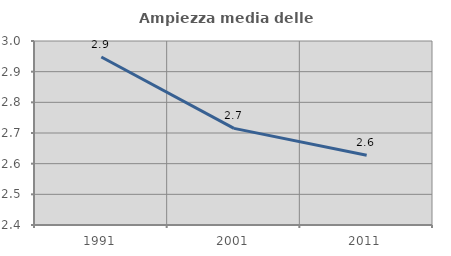
| Category | Ampiezza media delle famiglie |
|---|---|
| 1991.0 | 2.948 |
| 2001.0 | 2.715 |
| 2011.0 | 2.627 |